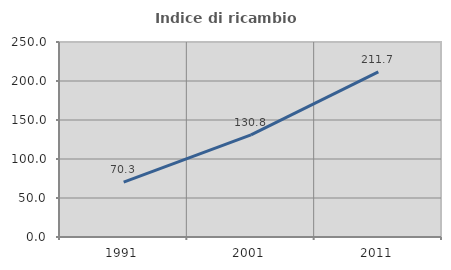
| Category | Indice di ricambio occupazionale  |
|---|---|
| 1991.0 | 70.27 |
| 2001.0 | 130.847 |
| 2011.0 | 211.717 |